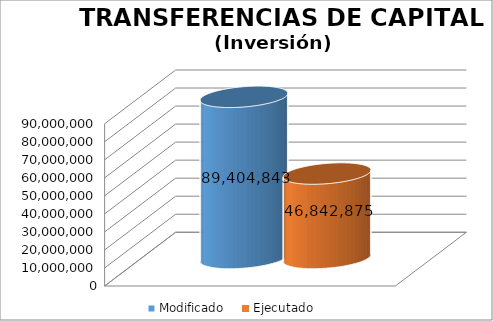
| Category | Modificado | Ejecutado |
|---|---|---|
| 0 | 89404843 | 46842874.8 |